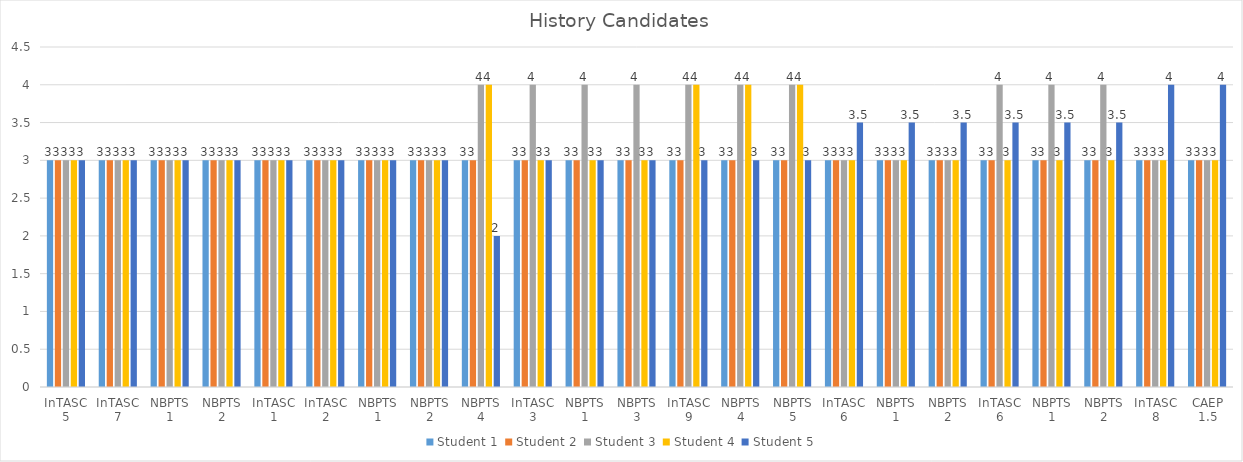
| Category | Student 1 | Student 2 | Student 3 | Student 4 | Student 5 |
|---|---|---|---|---|---|
| InTASC 5 | 3 | 3 | 3 | 3 | 3 |
| InTASC 7 | 3 | 3 | 3 | 3 | 3 |
| NBPTS 1 | 3 | 3 | 3 | 3 | 3 |
| NBPTS 2 | 3 | 3 | 3 | 3 | 3 |
| InTASC 1 | 3 | 3 | 3 | 3 | 3 |
| InTASC 2 | 3 | 3 | 3 | 3 | 3 |
| NBPTS 1 | 3 | 3 | 3 | 3 | 3 |
| NBPTS 2 | 3 | 3 | 3 | 3 | 3 |
| NBPTS 4 | 3 | 3 | 4 | 4 | 2 |
| InTASC 3 | 3 | 3 | 4 | 3 | 3 |
| NBPTS 1 | 3 | 3 | 4 | 3 | 3 |
| NBPTS 3 | 3 | 3 | 4 | 3 | 3 |
| InTASC 9 | 3 | 3 | 4 | 4 | 3 |
| NBPTS 4 | 3 | 3 | 4 | 4 | 3 |
| NBPTS 5 | 3 | 3 | 4 | 4 | 3 |
| InTASC 6 | 3 | 3 | 3 | 3 | 3.5 |
| NBPTS 1 | 3 | 3 | 3 | 3 | 3.5 |
| NBPTS 2 | 3 | 3 | 3 | 3 | 3.5 |
| InTASC 6 | 3 | 3 | 4 | 3 | 3.5 |
| NBPTS 1 | 3 | 3 | 4 | 3 | 3.5 |
| NBPTS 2 | 3 | 3 | 4 | 3 | 3.5 |
| InTASC 8 | 3 | 3 | 3 | 3 | 4 |
| CAEP 1.5 | 3 | 3 | 3 | 3 | 4 |